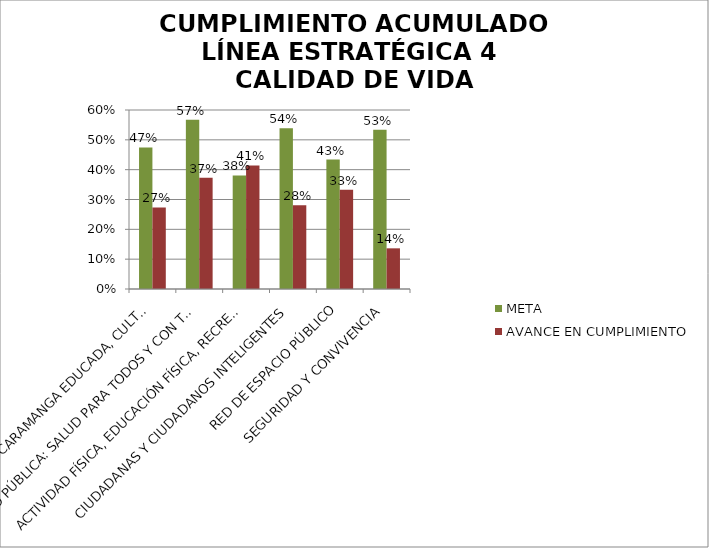
| Category | META | AVANCE EN CUMPLIMIENTO |
|---|---|---|
| EDUCACIÓN: BUCARAMANGA EDUCADA, CULTA E INNOVADORA | 0.475 | 0.274 |
| SALUD PÚBLICA: SALUD PARA TODOS Y CON TODOS | 0.567 | 0.373 |
| ACTIVIDAD FÍSICA, EDUCACIÓN FÍSICA, RECREACIÓN Y DEPORTE | 0.38 | 0.414 |
| CIUDADANAS Y CIUDADANOS INTELIGENTES | 0.539 | 0.28 |
| RED DE ESPACIO PÚBLICO | 0.434 | 0.333 |
| SEGURIDAD Y CONVIVENCIA | 0.534 | 0.136 |